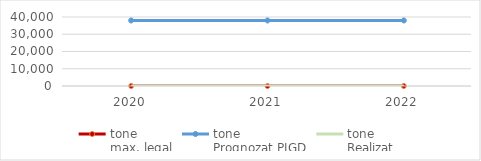
| Category | tone
max. legal | tone 
Prognozat PJGD | tone 
Realizat |
|---|---|---|---|
| 2020.0 | 0 | 37987 | 0 |
| 2021.0 | 0 | 37987 | 0 |
| 2022.0 | 0 | 37987 | 0 |